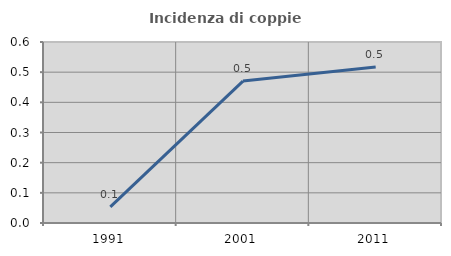
| Category | Incidenza di coppie miste |
|---|---|
| 1991.0 | 0.054 |
| 2001.0 | 0.47 |
| 2011.0 | 0.517 |